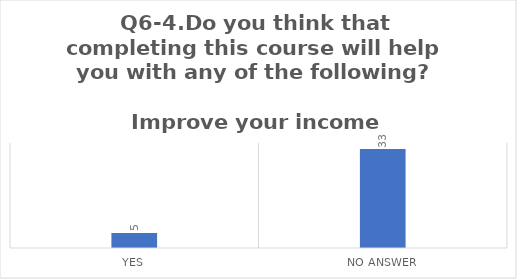
| Category | Q6-4.Do you think that completing this course will help you with any of the following?

Improve your income |
|---|---|
| Yes | 5 |
| No Answer | 33 |